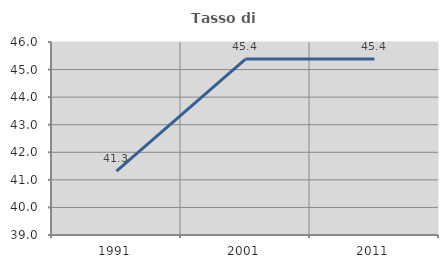
| Category | Tasso di occupazione   |
|---|---|
| 1991.0 | 41.313 |
| 2001.0 | 45.381 |
| 2011.0 | 45.386 |